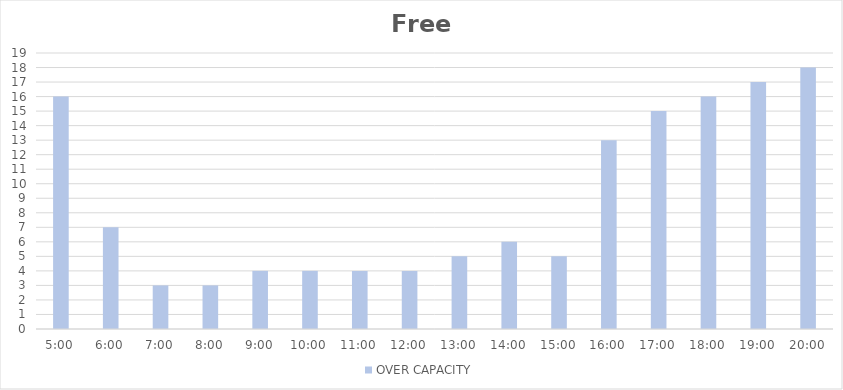
| Category | OVER CAPACITY |
|---|---|
| 0.20833333333333334 | 16 |
| 0.25 | 7 |
| 0.2916666666666667 | 3 |
| 0.3333333333333333 | 3 |
| 0.375 | 4 |
| 0.4166666666666667 | 4 |
| 0.4583333333333333 | 4 |
| 0.5 | 4 |
| 0.5416666666666666 | 5 |
| 0.5833333333333334 | 6 |
| 0.625 | 5 |
| 0.6666666666666666 | 13 |
| 0.7083333333333334 | 15 |
| 0.75 | 16 |
| 0.7916666666666666 | 17 |
| 0.8333333333333334 | 18 |